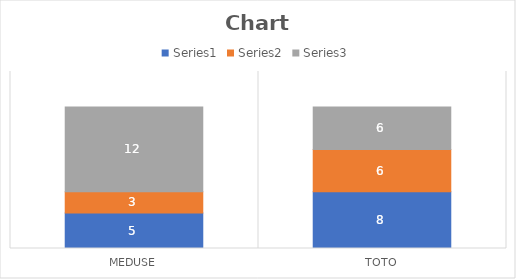
| Category | Series 0 | Series 1 | Series 2 |
|---|---|---|---|
| meduse | 5 | 3 | 12 |
| toto | 8 | 6 | 6 |